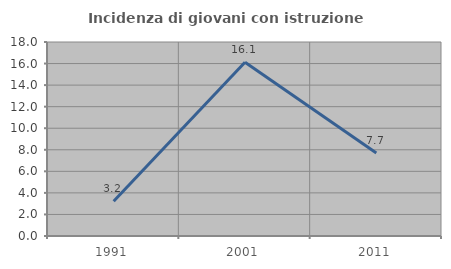
| Category | Incidenza di giovani con istruzione universitaria |
|---|---|
| 1991.0 | 3.226 |
| 2001.0 | 16.129 |
| 2011.0 | 7.692 |